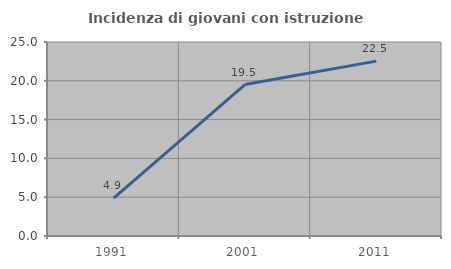
| Category | Incidenza di giovani con istruzione universitaria |
|---|---|
| 1991.0 | 4.878 |
| 2001.0 | 19.512 |
| 2011.0 | 22.535 |